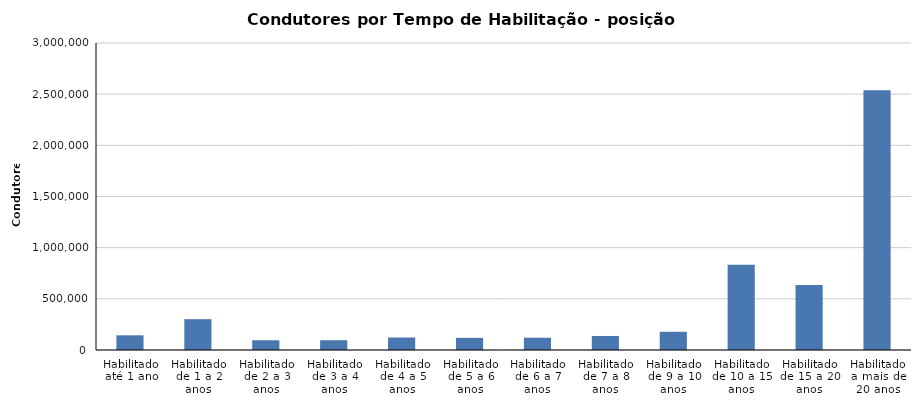
| Category | 2024/Maio |
|---|---|
| Habilitado até 1 ano | 143633 |
| Habilitado de 1 a 2 anos | 301130 |
| Habilitado de 2 a 3 anos | 95287 |
| Habilitado de 3 a 4 anos | 95432 |
| Habilitado de 4 a 5 anos | 121963 |
| Habilitado de 5 a 6 anos | 118377 |
| Habilitado de 6 a 7 anos | 119841 |
| Habilitado de 7 a 8 anos | 137130 |
| Habilitado de 9 a 10 anos | 178294 |
| Habilitado de 10 a 15 anos | 833530 |
| Habilitado de 15 a 20 anos | 633995 |
| Habilitado a mais de 20 anos | 2537737 |